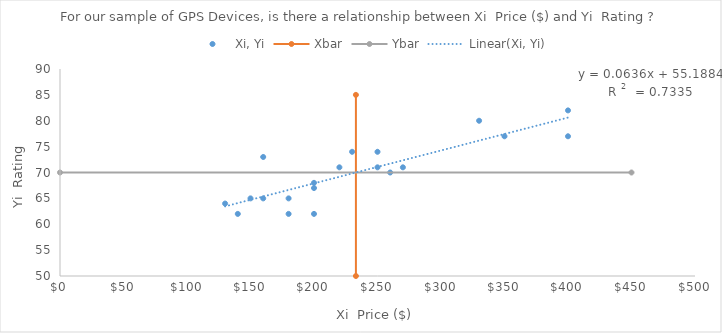
| Category | Xi, Yi |
|---|---|
| 140.0 | 62 |
| 180.0 | 62 |
| 130.0 | 64 |
| 180.0 | 65 |
| 150.0 | 65 |
| 160.0 | 65 |
| 220.0 | 71 |
| 250.0 | 71 |
| 270.0 | 71 |
| 160.0 | 73 |
| 230.0 | 74 |
| 330.0 | 80 |
| 400.0 | 82 |
| 250.0 | 74 |
| 400.0 | 77 |
| 350.0 | 77 |
| 260.0 | 70 |
| 200.0 | 67 |
| 200.0 | 68 |
| 200.0 | 62 |